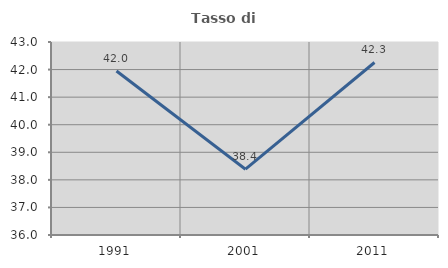
| Category | Tasso di occupazione   |
|---|---|
| 1991.0 | 41.95 |
| 2001.0 | 38.386 |
| 2011.0 | 42.257 |